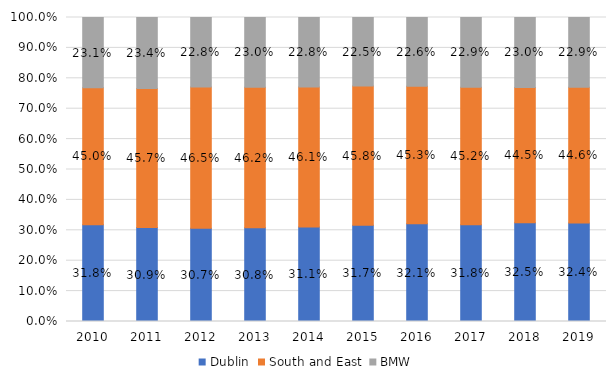
| Category | Dublin | South and East | BMW |
|---|---|---|---|
| 2010.0 | 0.318 | 0.45 | 0.231 |
| 2011.0 | 0.309 | 0.457 | 0.234 |
| 2012.0 | 0.307 | 0.465 | 0.228 |
| 2013.0 | 0.308 | 0.462 | 0.23 |
| 2014.0 | 0.311 | 0.461 | 0.228 |
| 2015.0 | 0.317 | 0.458 | 0.225 |
| 2016.0 | 0.321 | 0.453 | 0.226 |
| 2017.0 | 0.318 | 0.452 | 0.229 |
| 2018.0 | 0.325 | 0.445 | 0.23 |
| 2019.0 | 0.324 | 0.446 | 0.229 |